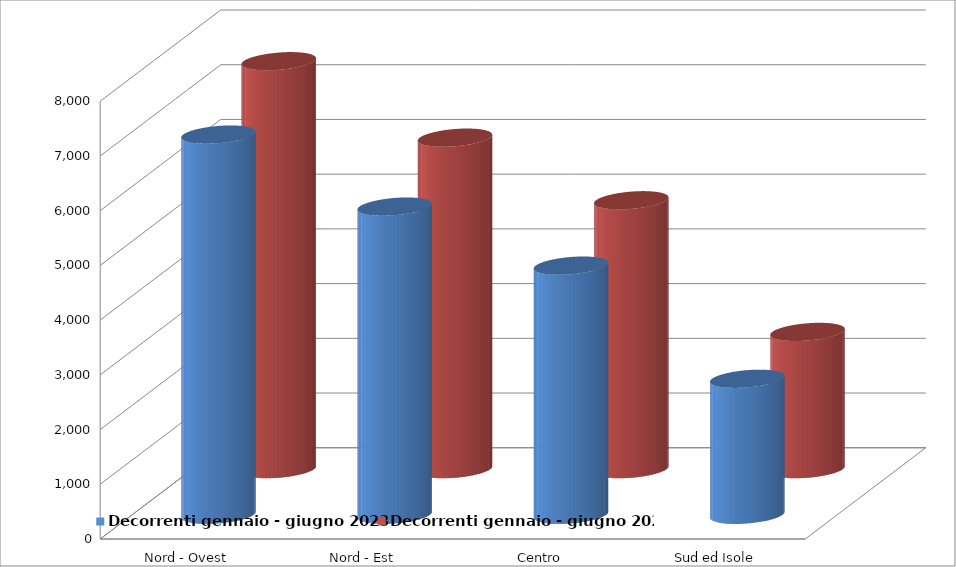
| Category | Decorrenti gennaio - giugno 2023 | Decorrenti gennaio - giugno 2022 |
|---|---|---|
| Nord - Ovest | 6949 | 7456 |
| Nord - Est | 5633 | 6059 |
| Centro | 4554 | 4915 |
| Sud ed Isole | 2486 | 2509 |